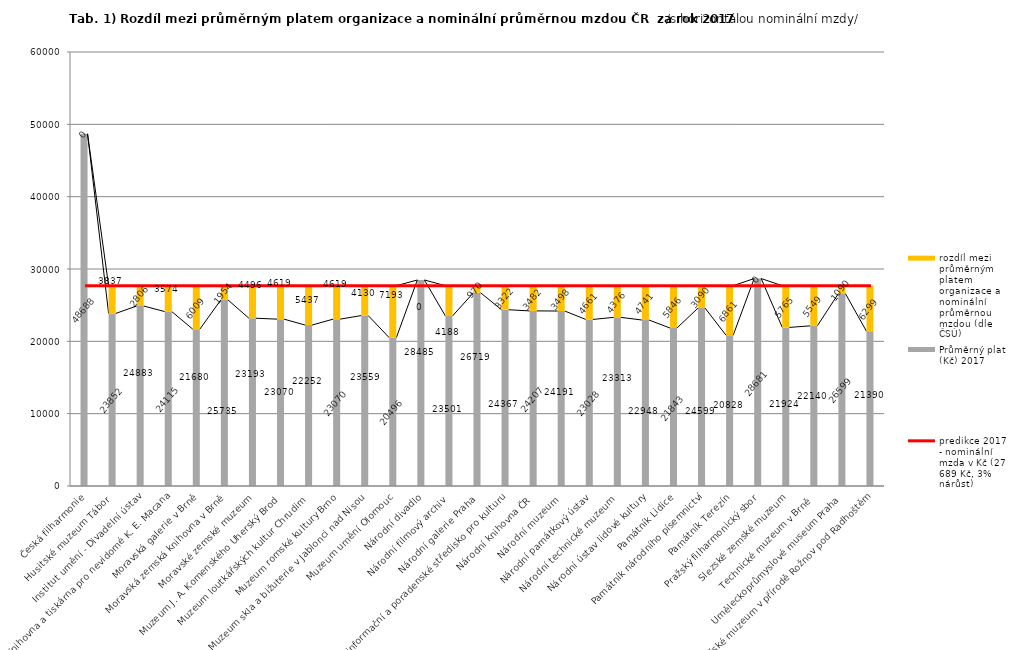
| Category | Průměrný plat (Kč) 2017 | rozdíl mezi průměrným platem organizace a nominální průměrnou mzdou (dle ČSÚ) |
|---|---|---|
| Česká filharmonie | 48688 | 0 |
| Husitské muzeum Tábor | 23852 | 3837 |
| Institut umění - Divadelní ústav | 24883 | 2806 |
| Knihovna a tiskárna pro nevidomé K. E. Macana | 24115 | 3574 |
| Moravská galerie v Brně | 21680 | 6009 |
| Moravská zemská knihovna v Brně | 25735 | 1954 |
| Moravské zemské muzeum | 23193 | 4496 |
| Muzeum J. A. Komenského Uherský Brod | 23070 | 4619 |
| Muzeum loutkářských kultur Chrudim | 22252 | 5437 |
| Muzeum romské kultury Brno | 23070 | 4619 |
| Muzeum skla a bižuterie v Jablonci nad Nisou | 23559 | 4130 |
| Muzeum umění Olomouc | 20496 | 7193 |
| Národní divadlo | 28485 | 0 |
| Národní filmový archiv | 23501 | 4188 |
| Národní galerie Praha | 26719 | 970 |
| Národní informační a poradenské středisko pro kulturu | 24367 | 3322 |
| Národní knihovna ČR | 24207 | 3482 |
| Národní muzeum | 24191 | 3498 |
| Národní památkový ústav | 23028 | 4661 |
| Národní technické muzeum | 23313 | 4376 |
| Národní ústav lidové kultury | 22948 | 4741 |
| Památník Lidice | 21843 | 5846 |
| Památník národního písemnictví | 24599 | 3090 |
| Památník Terezín | 20828 | 6861 |
| Pražský filharmonický sbor | 28681 | 0 |
| Slezské zemské muzeum | 21924 | 5765 |
| Technické muzeum v Brně  | 22140 | 5549 |
| Uměleckoprůmyslové museum Praha | 26599 | 1090 |
| Valašské muzeum v přírodě Rožnov pod Radhoštěm | 21390 | 6299 |